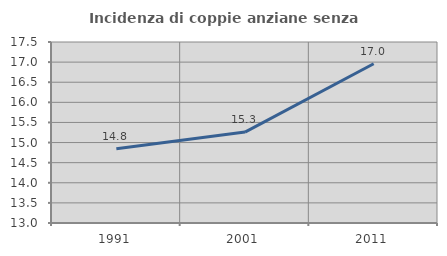
| Category | Incidenza di coppie anziane senza figli  |
|---|---|
| 1991.0 | 14.848 |
| 2001.0 | 15.26 |
| 2011.0 | 16.958 |